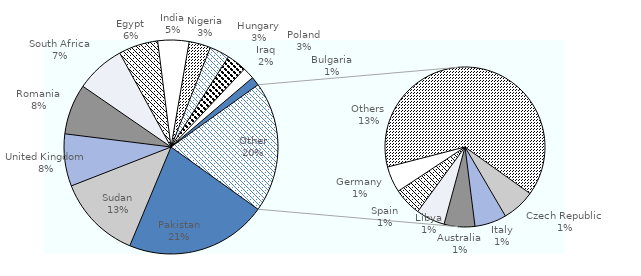
| Category | Series 0 |
|---|---|
| Pakistan | 2057 |
| Sudan | 1228 |
| United Kingdom | 758 |
| Romania | 733 |
| South Africa | 716 |
| Egypt | 572 |
| India | 453 |
| Nigeria | 314 |
| Hungary | 291 |
| Poland | 288 |
| Iraq | 170 |
| Bulgaria | 128 |
| Czech Republic | 127 |
| Italy | 122 |
| Australia | 118 |
| Libya | 111 |
| Spain | 107 |
| Germany | 100 |
| Others  | 1213 |